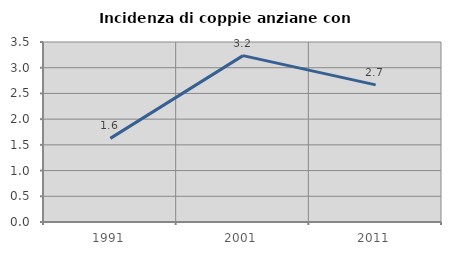
| Category | Incidenza di coppie anziane con figli |
|---|---|
| 1991.0 | 1.626 |
| 2001.0 | 3.235 |
| 2011.0 | 2.667 |